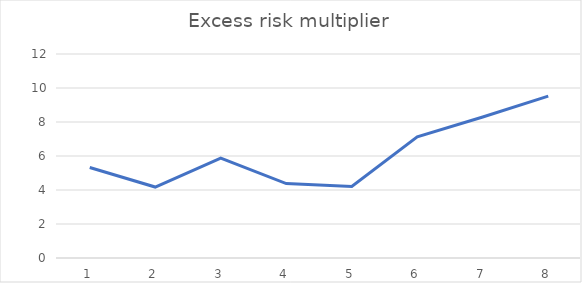
| Category | Excess risk multiplier |
|---|---|
| 0 | 5.325 |
| 1 | 4.174 |
| 2 | 5.88 |
| 3 | 4.376 |
| 4 | 4.207 |
| 5 | 7.133 |
| 6 | 8.297 |
| 7 | 9.526 |